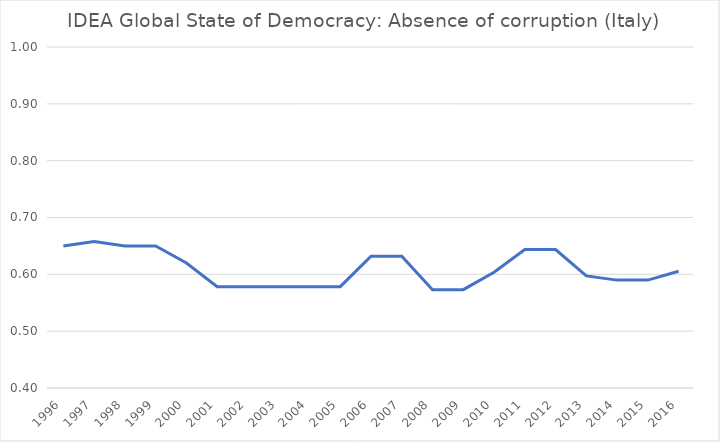
| Category | C_SD41  |
|---|---|
| 1996.0 | 0.65 |
| 1997.0 | 0.658 |
| 1998.0 | 0.65 |
| 1999.0 | 0.65 |
| 2000.0 | 0.62 |
| 2001.0 | 0.578 |
| 2002.0 | 0.578 |
| 2003.0 | 0.578 |
| 2004.0 | 0.578 |
| 2005.0 | 0.578 |
| 2006.0 | 0.632 |
| 2007.0 | 0.632 |
| 2008.0 | 0.573 |
| 2009.0 | 0.573 |
| 2010.0 | 0.604 |
| 2011.0 | 0.644 |
| 2012.0 | 0.644 |
| 2013.0 | 0.597 |
| 2014.0 | 0.59 |
| 2015.0 | 0.59 |
| 2016.0 | 0.606 |